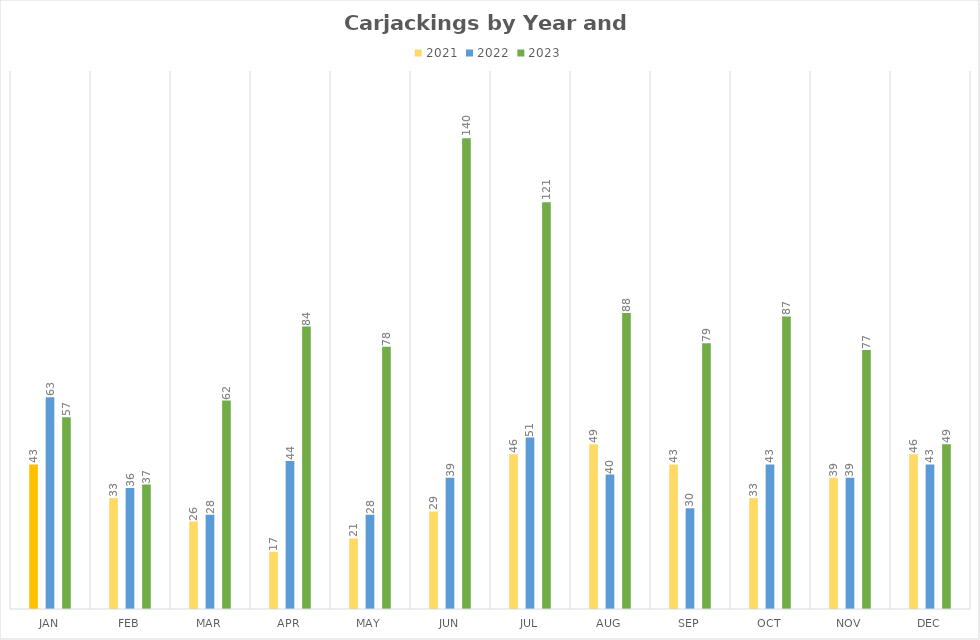
| Category | 2021 | 2022 | 2023 |
|---|---|---|---|
| Jan | 43 | 63 | 57 |
| Feb | 33 | 36 | 37 |
| Mar | 26 | 28 | 62 |
| Apr | 17 | 44 | 84 |
| May | 21 | 28 | 78 |
| Jun | 29 | 39 | 140 |
| Jul | 46 | 51 | 121 |
| Aug | 49 | 40 | 88 |
| Sep | 43 | 30 | 79 |
| Oct | 33 | 43 | 87 |
| Nov | 39 | 39 | 77 |
| Dec | 46 | 43 | 49 |